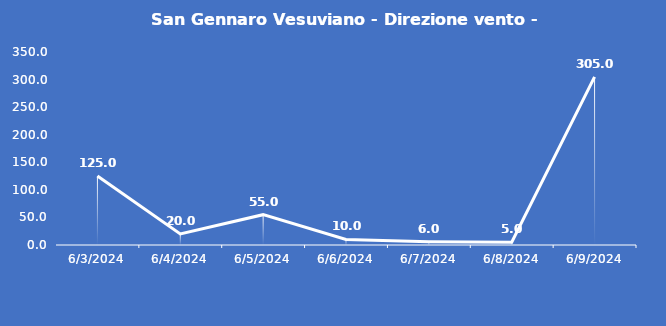
| Category | San Gennaro Vesuviano - Direzione vento - Grezzo (°N) |
|---|---|
| 6/3/24 | 125 |
| 6/4/24 | 20 |
| 6/5/24 | 55 |
| 6/6/24 | 10 |
| 6/7/24 | 6 |
| 6/8/24 | 5 |
| 6/9/24 | 305 |